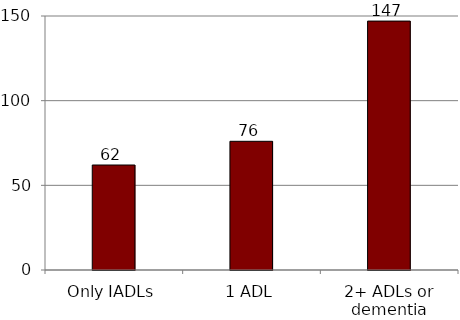
| Category | Series 0 |
|---|---|
| Only IADLs | 62 |
| 1 ADL | 76 |
| 2+ ADLs or dementia | 147 |